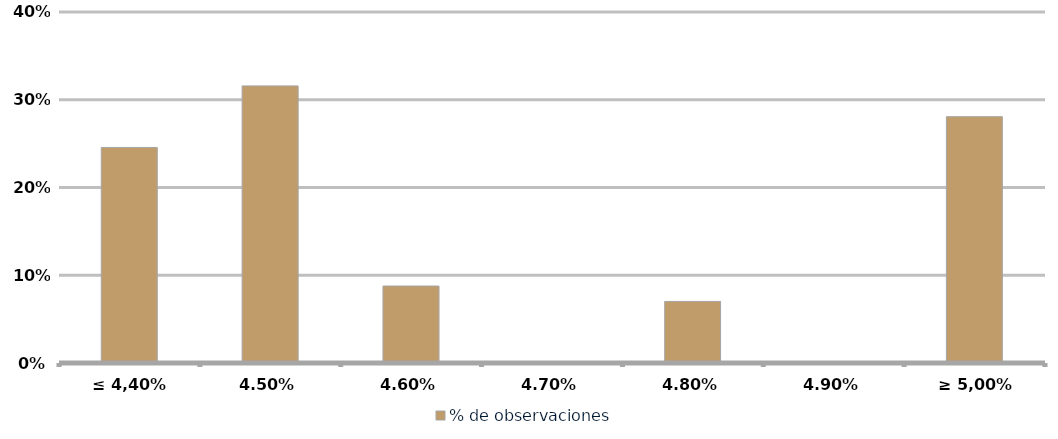
| Category | % de observaciones  |
|---|---|
| ≤ 4,40% | 0.246 |
| 4,50% | 0.316 |
| 4,60% | 0.088 |
| 4,70% | 0 |
| 4,80% | 0.07 |
| 4,90% | 0 |
| ≥ 5,00% | 0.281 |